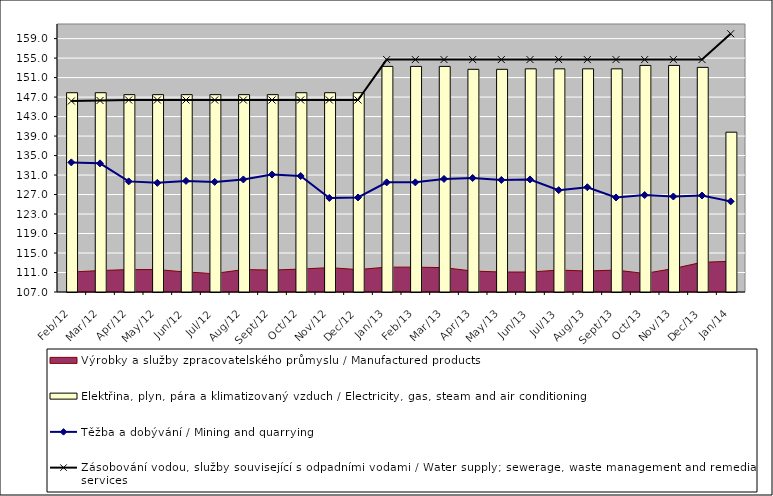
| Category | Elektřina, plyn, pára a klimatizovaný vzduch / Electricity, gas, steam and air conditioning |
|---|---|
| 2012-02-01 | 147.9 |
| 2012-03-01 | 147.9 |
| 2012-04-01 | 147.5 |
| 2012-05-01 | 147.5 |
| 2012-06-01 | 147.5 |
| 2012-07-01 | 147.5 |
| 2012-08-01 | 147.5 |
| 2012-09-01 | 147.5 |
| 2012-10-01 | 147.9 |
| 2012-11-01 | 147.9 |
| 2012-12-01 | 147.9 |
| 2013-01-01 | 153.3 |
| 2013-02-01 | 153.3 |
| 2013-03-01 | 153.3 |
| 2013-04-01 | 152.7 |
| 2013-05-01 | 152.7 |
| 2013-06-01 | 152.8 |
| 2013-07-01 | 152.8 |
| 2013-08-01 | 152.8 |
| 2013-09-01 | 152.8 |
| 2013-10-01 | 153.5 |
| 2013-11-01 | 153.5 |
| 2013-12-01 | 153.1 |
| 2014-01-01 | 139.8 |